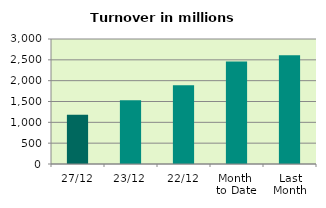
| Category | Series 0 |
|---|---|
| 27/12 | 1182.974 |
| 23/12 | 1532.182 |
| 22/12 | 1892.422 |
| Month 
to Date | 2459.32 |
| Last
Month | 2611.78 |